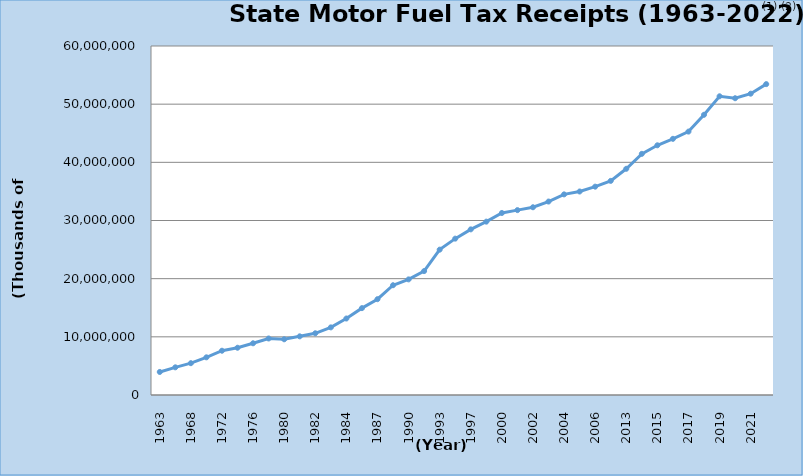
| Category | Series 0 |
|---|---|
| 1963.0 | 3962868 |
| 1966.0 | 4757636 |
| 1968.0 | 5470199 |
| 1970.0 | 6477019 |
| 1972.0 | 7611498 |
| 1974.0 | 8124158 |
| 1976.0 | 8891460 |
| 1978.0 | 9716246 |
| 1980.0 | 9577740 |
| 1981.0 | 10083810 |
| 1982.0 | 10610419 |
| 1983.0 | 11627177 |
| 1984.0 | 13149742 |
| 1986.0 | 14932258 |
| 1987.0 | 16473496 |
| 1989.0 | 18869419 |
| 1990.0 | 19877713 |
| 1991.0 | 21305466.5 |
| 1993.0 | 24989863.548 |
| 1995.0 | 26881169 |
| 1997.0 | 28476881 |
| 1998.0 | 29802864 |
| 2000.0 | 31291017 |
| 2001.0 | 31783843 |
| 2002.0 | 32275459 |
| 2003.0 | 33257334 |
| 2004.0 | 34491295 |
| 2005.0 | 34984939 |
| 2006.0 | 35818306 |
| 2007.0 | 36811361 |
| 2013.0 | 38888831 |
| 2014.0 | 41457504 |
| 2015.0 | 42930536 |
| 2016.0 | 44039960.176 |
| 2017.0 | 45283299 |
| 2018.0 | 48177762 |
| 2019.0 | 51354884 |
| 2020.0 | 51020975 |
| 2021.0 | 51802919 |